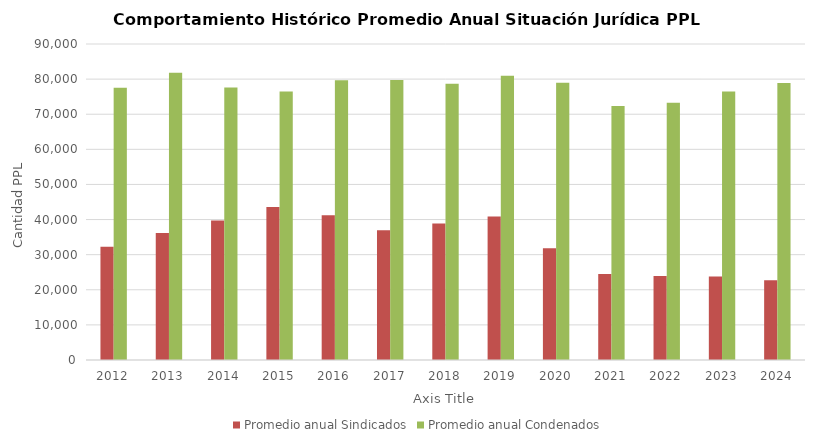
| Category | Promedio anual Sindicados | Promedio anual Condenados |
|---|---|---|
| 2012.0 | 32250.083 | 77572 |
| 2013.0 | 36194.167 | 81792.083 |
| 2014.0 | 39755 | 77634.083 |
| 2015.0 | 43545.833 | 76494.25 |
| 2016.0 | 41229.083 | 79684.917 |
| 2017.0 | 36925.5 | 79732.167 |
| 2018.0 | 38890.25 | 78679.333 |
| 2019.0 | 40870.083 | 80977.25 |
| 2020.0 | 31861.083 | 78969.25 |
| 2021.0 | 24484.417 | 72353.083 |
| 2022.0 | 23917.667 | 73258.25 |
| 2023.0 | 23757.25 | 76504.667 |
| 2024.0 | 22745 | 78897.8 |